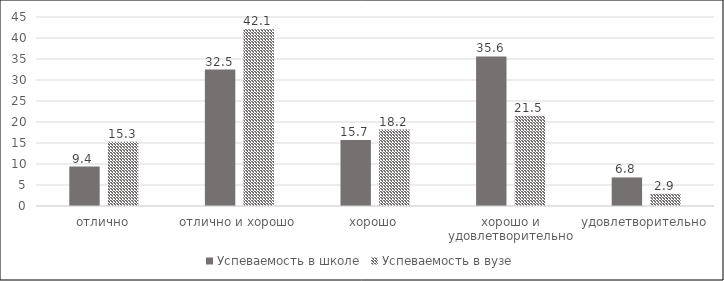
| Category | Успеваемость в школе | Успеваемость в вузе |
|---|---|---|
| отлично | 9.4 | 15.3 |
| отлично и хорошо | 32.5 | 42.1 |
| хорошо | 15.7 | 18.2 |
| хорошо и удовлетворительно | 35.6 | 21.5 |
| удовлетворительно | 6.8 | 2.9 |